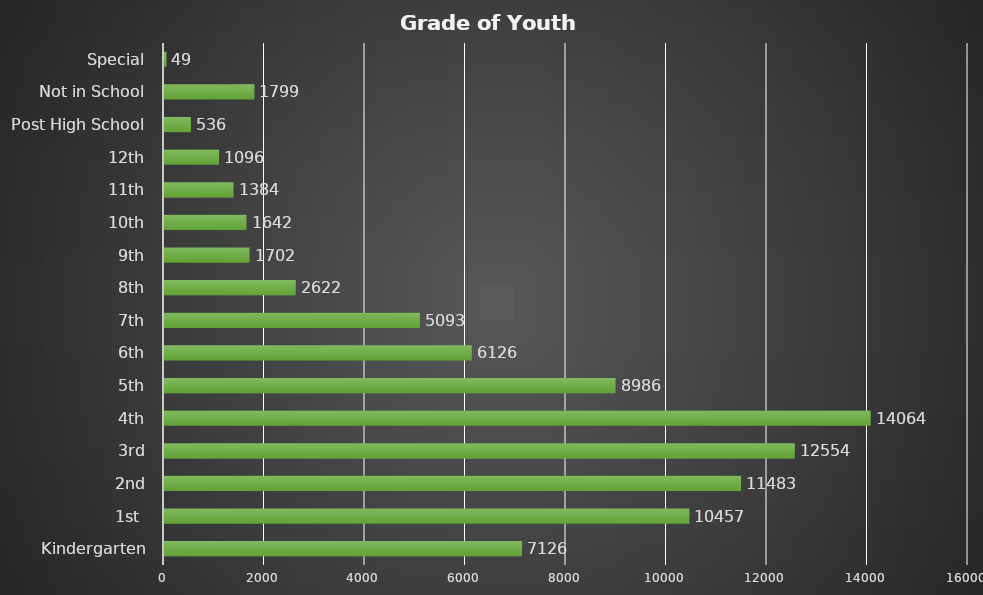
| Category | Number of Youth |
|---|---|
| Kindergarten | 7126 |
| 1st  | 10457 |
| 2nd | 11483 |
| 3rd | 12554 |
| 4th | 14064 |
| 5th | 8986 |
| 6th | 6126 |
| 7th | 5093 |
| 8th | 2622 |
| 9th | 1702 |
| 10th | 1642 |
| 11th | 1384 |
| 12th | 1096 |
| Post High School | 536 |
| Not in School | 1799 |
| Special | 49 |